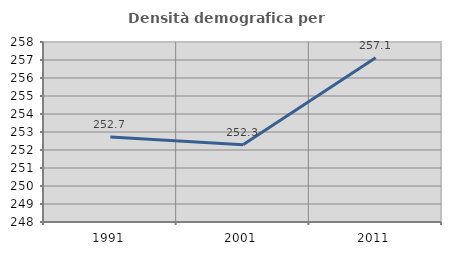
| Category | Densità demografica |
|---|---|
| 1991.0 | 252.728 |
| 2001.0 | 252.297 |
| 2011.0 | 257.129 |